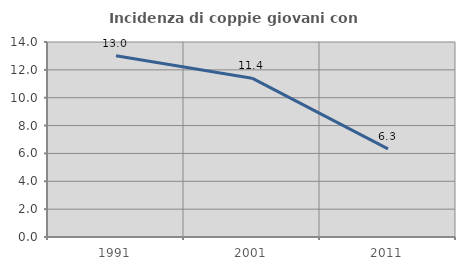
| Category | Incidenza di coppie giovani con figli |
|---|---|
| 1991.0 | 13.008 |
| 2001.0 | 11.404 |
| 2011.0 | 6.329 |